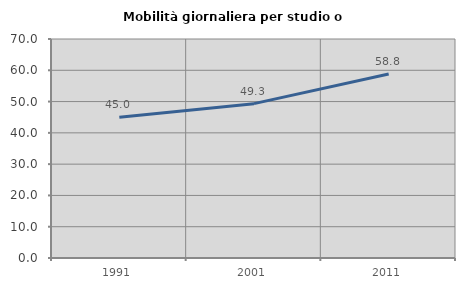
| Category | Mobilità giornaliera per studio o lavoro |
|---|---|
| 1991.0 | 44.955 |
| 2001.0 | 49.335 |
| 2011.0 | 58.805 |